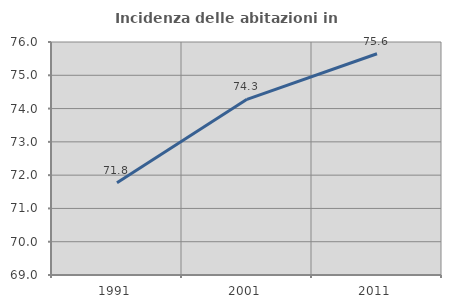
| Category | Incidenza delle abitazioni in proprietà  |
|---|---|
| 1991.0 | 71.773 |
| 2001.0 | 74.277 |
| 2011.0 | 75.648 |